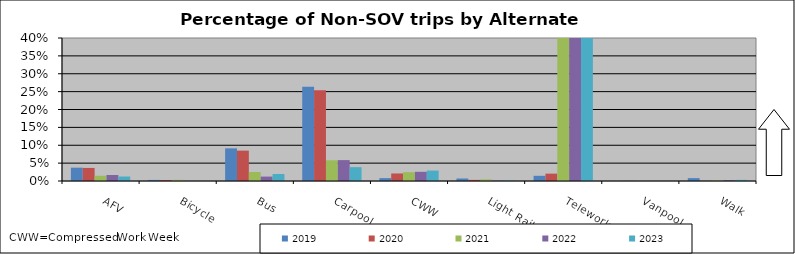
| Category | 2019 | 2020 | 2021 | 2022 | 2023 |
|---|---|---|---|---|---|
| AFV | 0.037 | 0.037 | 0.015 | 0.017 | 0.013 |
| Bicycle | 0.003 | 0.003 | 0.003 | 0 | 0 |
| Bus | 0.091 | 0.085 | 0.025 | 0.012 | 0.02 |
| Carpool | 0.264 | 0.254 | 0.058 | 0.058 | 0.039 |
| CWW | 0.008 | 0.021 | 0.025 | 0.026 | 0.029 |
| Light Rail | 0.007 | 0.003 | 0.004 | 0.001 | 0.001 |
| Telework | 0.015 | 0.021 | 0.619 | 0.643 | 0.699 |
| Vanpool | 0 | 0 | 0 | 0 | 0 |
| Walk | 0.008 | 0 | 0.001 | 0.002 | 0.003 |